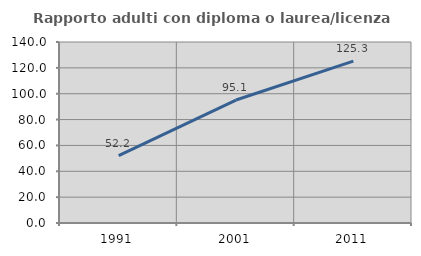
| Category | Rapporto adulti con diploma o laurea/licenza media  |
|---|---|
| 1991.0 | 52.174 |
| 2001.0 | 95.122 |
| 2011.0 | 125.253 |